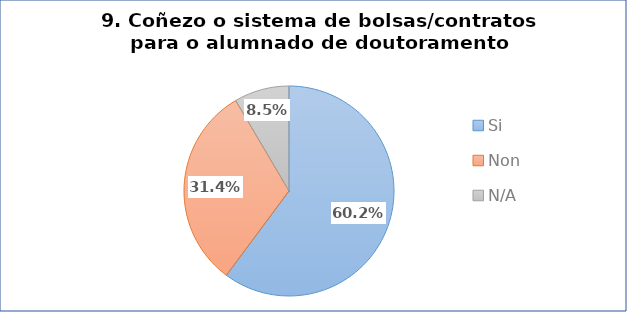
| Category | Pregunta 9. Coñezo o sistema de bolsas/contratos da etapa de formación para o alumnado de doutoramento |
|---|---|
| Si | 0.602 |
| Non | 0.314 |
| N/A | 0.085 |